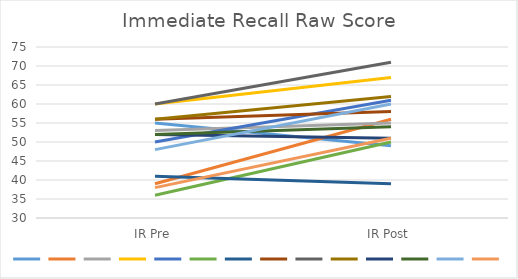
| Category | Series 0 | Series 1 | Series 2 | Series 3 | Series 4 | Series 5 | Series 6 | Series 7 | Series 8 | Series 9 | Series 10 | Series 11 | Series 12 | Series 13 |
|---|---|---|---|---|---|---|---|---|---|---|---|---|---|---|
| IR Pre | 55 | 39 | 53 | 60 | 50 | 36 | 41 | 56 | 60 | 56 | 52 | 52 | 48 | 38 |
| IR Post | 49 | 56 | 55 | 67 | 61 | 50 | 39 | 58 | 71 | 62 | 51 | 54 | 60 | 51 |